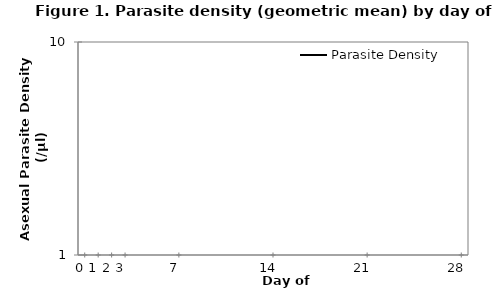
| Category | Parasite Density | Series 1 |
|---|---|---|
| 0.0 | 0 | 1 |
| 1900-01-01 | 0 | 1 |
| 1900-01-02 | 0 | 1 |
| 1900-01-03 | 0 | 1 |
| 1900-01-07 | 0 | 1 |
| 1900-01-14 | 0 | 1 |
| 1900-01-21 | 0 | 1 |
| 1900-01-28 | 0 | 1 |